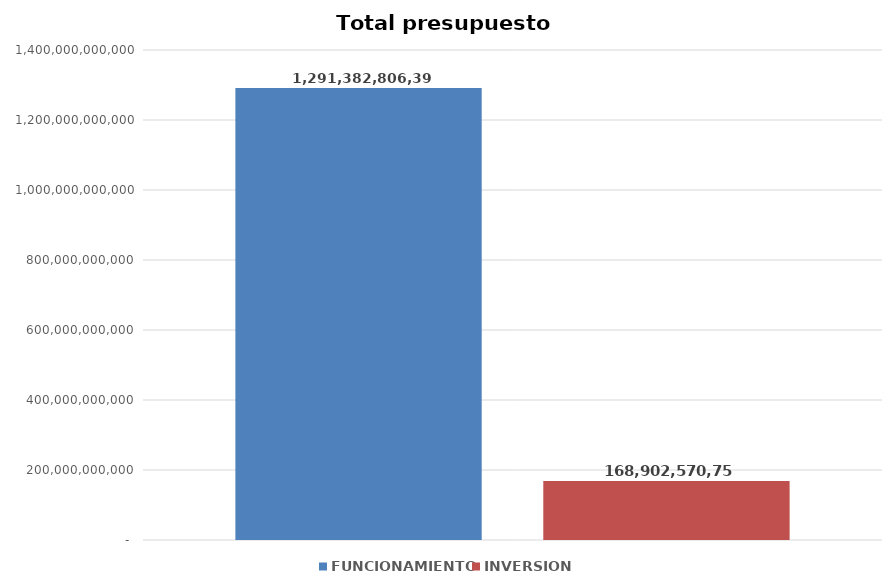
| Category | FUNCIONAMIENTO | INVERSION  |
|---|---|---|
| 0 | 1291382806397 | 168902570755 |